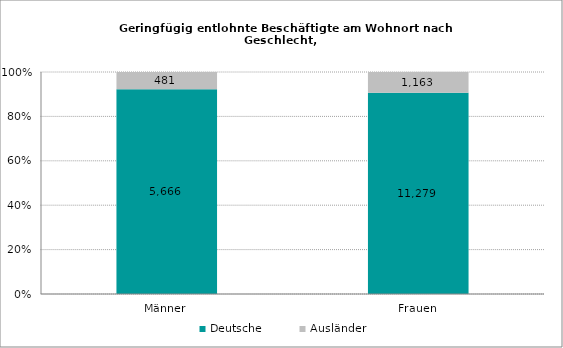
| Category | Deutsche | Ausländer |
|---|---|---|
| Männer | 5666 | 481 |
| Frauen | 11279 | 1163 |